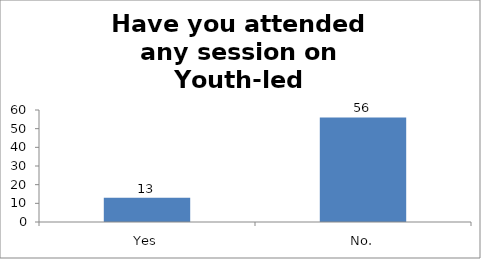
| Category | Have you attended any session on Youth-led Changemaking before? |
|---|---|
| Yes | 13 |
| No. | 56 |